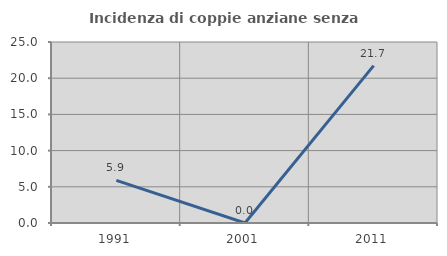
| Category | Incidenza di coppie anziane senza figli  |
|---|---|
| 1991.0 | 5.882 |
| 2001.0 | 0 |
| 2011.0 | 21.739 |